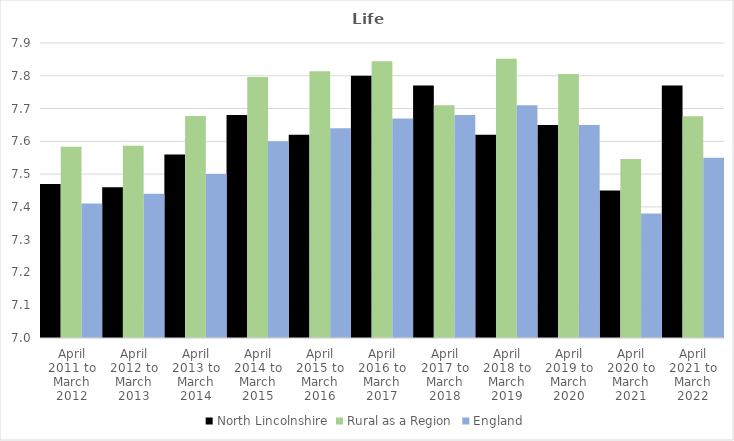
| Category | North Lincolnshire | Rural as a Region | England |
|---|---|---|---|
| April 2011 to March 2012 | 7.47 | 7.584 | 7.41 |
| April 2012 to March 2013 | 7.46 | 7.586 | 7.44 |
| April 2013 to March 2014 | 7.56 | 7.677 | 7.5 |
| April 2014 to March 2015 | 7.68 | 7.797 | 7.6 |
| April 2015 to March 2016 | 7.62 | 7.813 | 7.64 |
| April 2016 to March 2017 | 7.8 | 7.845 | 7.67 |
| April 2017 to March 2018 | 7.77 | 7.71 | 7.68 |
| April 2018 to March 2019 | 7.62 | 7.852 | 7.71 |
| April 2019 to March 2020 | 7.65 | 7.806 | 7.65 |
| April 2020 to March 2021 | 7.45 | 7.546 | 7.38 |
| April 2021 to March 2022 | 7.77 | 7.677 | 7.55 |